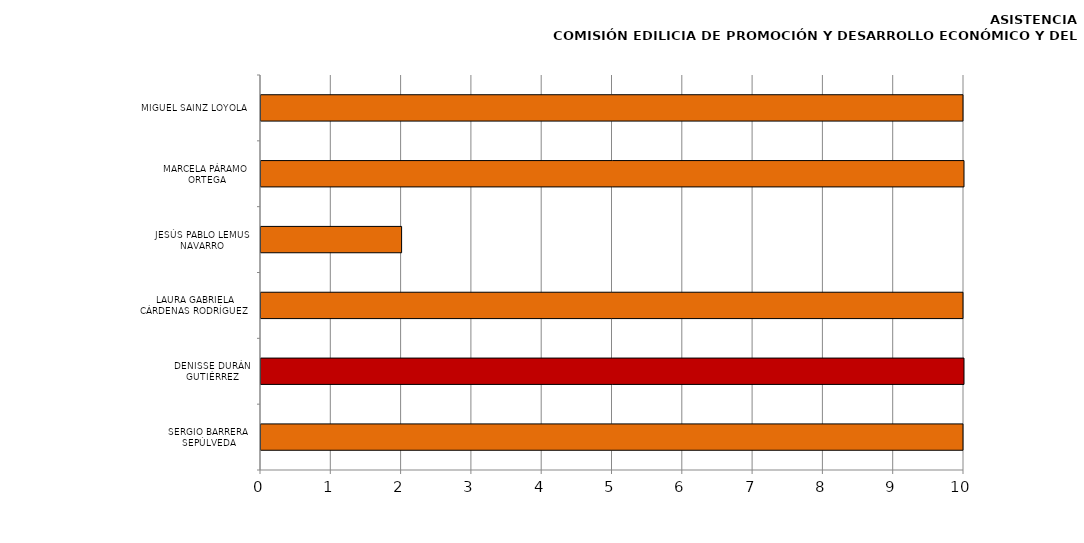
| Category | Series 0 |
|---|---|
| SERGIO BARRERA SEPÚLVEDA | 12 |
| DENISSE DURÁN GUTIÉRREZ | 10 |
| LAURA GABRIELA CÁRDENAS RODRÍGUEZ | 11 |
| JESÚS PABLO LEMUS NAVARRO | 2 |
| MARCELA PÁRAMO ORTEGA | 10 |
| MIGUEL SAINZ LOYOLA | 11 |